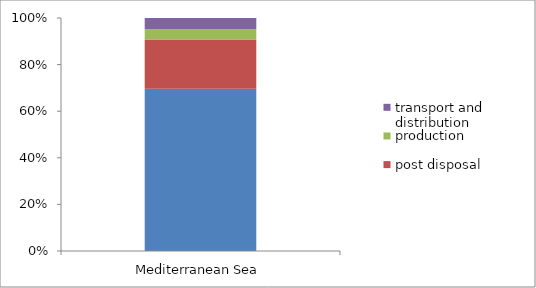
| Category | consumption | post disposal | production | transport and distribution |
|---|---|---|---|---|
| Mediterranean Sea | 0.697 | 0.212 | 0.043 | 0.049 |